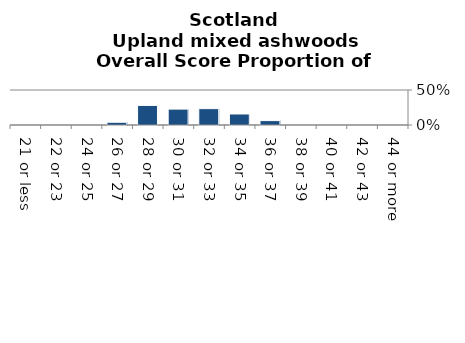
| Category | Upland mixed ashwoods |
|---|---|
| 21 or less | 0 |
| 22 or 23 | 0 |
| 24 or 25 | 0 |
| 26 or 27 | 0.039 |
| 28 or 29 | 0.28 |
| 30 or 31 | 0.227 |
| 32 or 33 | 0.234 |
| 34 or 35 | 0.157 |
| 36 or 37 | 0.063 |
| 38 or 39 | 0 |
| 40 or 41 | 0 |
| 42 or 43 | 0 |
| 44 or more | 0 |